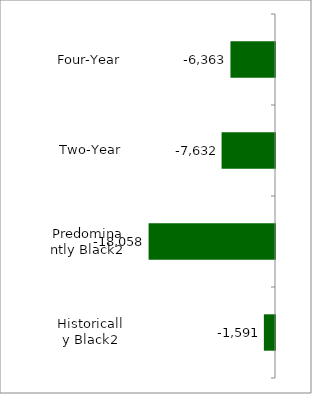
| Category | State |
|---|---|
| Four-Year | -6363 |
| Two-Year | -7632 |
| Predominantly Black2 | -18058 |
| Historically Black2 | -1591 |